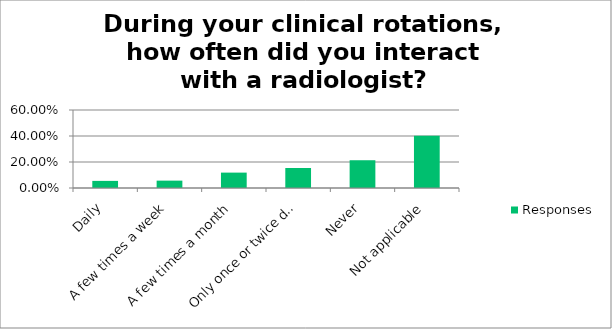
| Category | Responses |
|---|---|
| Daily | 0.055 |
| A few times a week | 0.057 |
| A few times a month | 0.118 |
| Only once or twice during the year | 0.154 |
| Never | 0.214 |
| Not applicable | 0.403 |